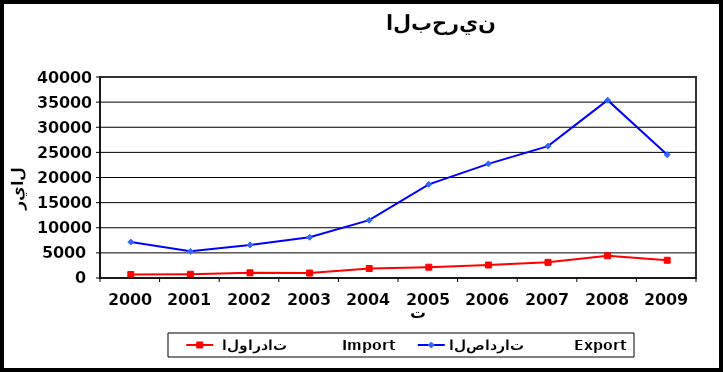
| Category |  الواردات           Import | الصادرات          Export |
|---|---|---|
| 2000.0 | 691 | 7158 |
| 2001.0 | 746 | 5304 |
| 2002.0 | 1032 | 6577 |
| 2003.0 | 988 | 8105 |
| 2004.0 | 1885 | 11507 |
| 2005.0 | 2146 | 18637 |
| 2006.0 | 2585 | 22717 |
| 2007.0 | 3116 | 26238 |
| 2008.0 | 4429 | 35389 |
| 2009.0 | 3530 | 24534 |